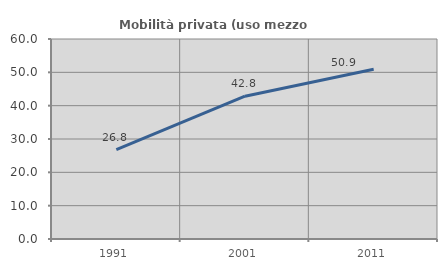
| Category | Mobilità privata (uso mezzo privato) |
|---|---|
| 1991.0 | 26.833 |
| 2001.0 | 42.828 |
| 2011.0 | 50.906 |